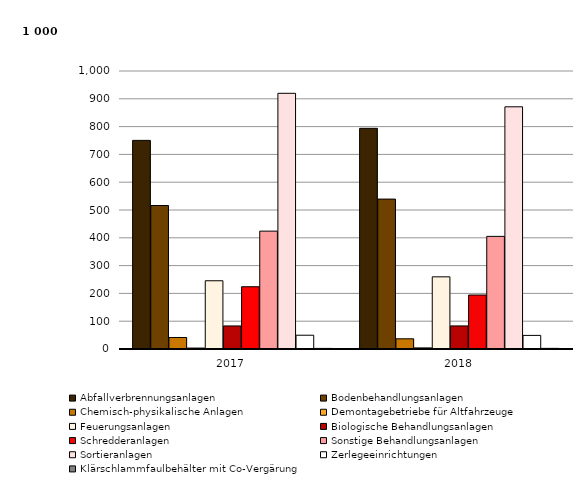
| Category | Abfallverbrennungsanlagen | Bodenbehandlungsanlagen | Chemisch-physikalische Anlagen | Demontagebetriebe für Altfahrzeuge | Feuerungsanlagen | Biologische Behandlungsanlagen | Schredderanlagen | Sonstige Behandlungsanlagen | Sortieranlagen | Zerlegeeinrichtungen | Klärschlammfaulbehälter mit Co-Vergärung |
|---|---|---|---|---|---|---|---|---|---|---|---|
| 2017.0 | 750410 | 516173 | 41341 | 3360 | 245469 | 82917 | 223924 | 423966 | 919761 | 49551 | 2112 |
| 2018.0 | 793771 | 539246 | 36745 | 3948 | 259572 | 82991 | 194138 | 405083 | 871215 | 48914 | 2275 |